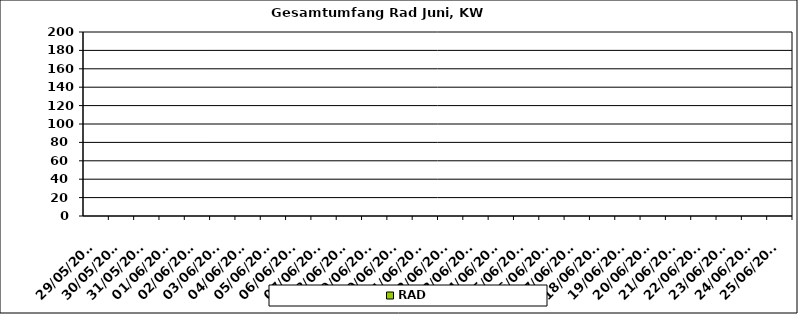
| Category | RAD |
|---|---|
| 29/05/2023 | 0 |
| 30/05/2023 | 0 |
| 31/05/2023 | 0 |
| 01/06/2023 | 0 |
| 02/06/2023 | 0 |
| 03/06/2023 | 0 |
| 04/06/2023 | 0 |
| 05/06/2023 | 0 |
| 06/06/2023 | 0 |
| 07/06/2023 | 0 |
| 08/06/2023 | 0 |
| 09/06/2023 | 0 |
| 10/06/2023 | 0 |
| 11/06/2023 | 0 |
| 12/06/2023 | 0 |
| 13/06/2023 | 0 |
| 14/06/2023 | 0 |
| 15/06/2023 | 0 |
| 16/06/2023 | 0 |
| 17/06/2023 | 0 |
| 18/06/2023 | 0 |
| 19/06/2023 | 0 |
| 20/06/2023 | 0 |
| 21/06/2023 | 0 |
| 22/06/2023 | 0 |
| 23/06/2023 | 0 |
| 24/06/2023 | 0 |
| 25/06/2023 | 0 |